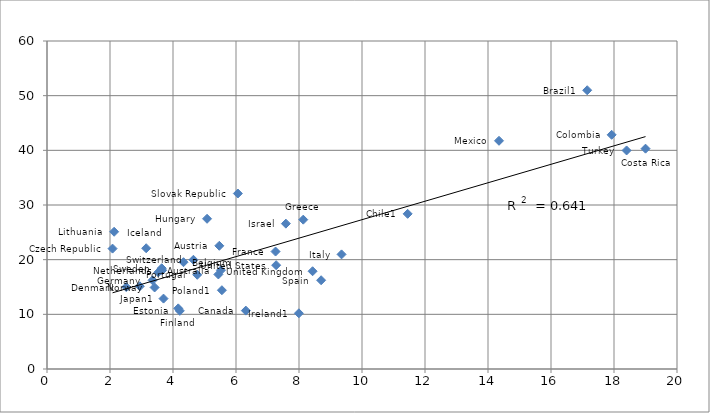
| Category | Literacy proficiency 
below Level 2 |
|---|---|
| 4.2167153 | 10.639 |
| 4.1666665 | 11.091 |
| 3.699199 | 12.878 |
| 6.3121271 | 10.682 |
| 2.5153203 | 14.996 |
| 7.996387 | 10.191 |
| 3.4161491 | 14.914 |
| 3.3506637 | 16.226 |
| 5.5525012 | 14.412 |
| 2.9467714 | 15.14 |
| 3.5333407 | 17.679 |
| 3.6559803 | 18.064 |
| 4.7691083 | 17.233 |
| 3.6419399 | 18.429 |
| 5.4402514 | 17.298 |
| 5.5231562 | 18.067 |
| 4.6490993 | 19.977 |
| 4.3335156 | 19.535 |
| 2.0813158 | 22.023 |
| 8.7026138 | 16.236 |
| 3.1491425 | 22.089 |
| 7.2751832 | 18.99 |
| 8.431469 | 17.882 |
| 2.13113 | 25.106 |
| 7.2553821 | 21.486 |
| 9.3510122 | 20.967 |
| 5.0807853 | 27.478 |
| 7.5833278 | 26.591 |
| 8.1349669 | 27.317 |
| 6.0586414 | 32.101 |
| 11.449327 | 28.385 |
| 14.3493 | 41.745 |
| 18.399616 | 39.978 |
| 19.001392 | 40.306 |
| 17.925772 | 42.84 |
| 17.149776 | 50.992 |
| 5.4698844 | 22.54 |